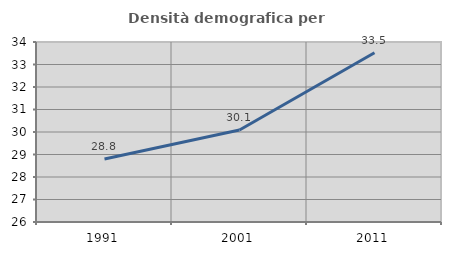
| Category | Densità demografica |
|---|---|
| 1991.0 | 28.799 |
| 2001.0 | 30.088 |
| 2011.0 | 33.52 |